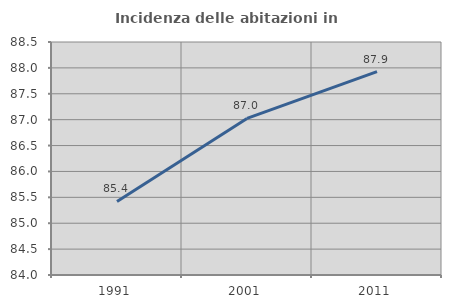
| Category | Incidenza delle abitazioni in proprietà  |
|---|---|
| 1991.0 | 85.42 |
| 2001.0 | 87.024 |
| 2011.0 | 87.929 |